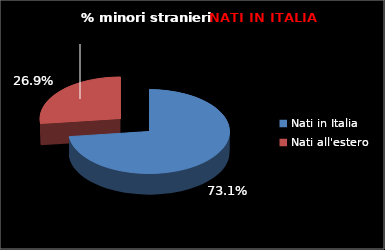
| Category | Series 0 |
|---|---|
| Nati in Italia | 244 |
| Nati all'estero | 90 |